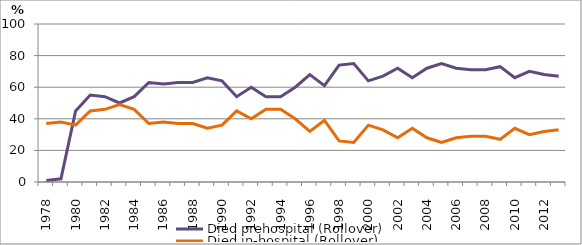
| Category | Died prehospital (Rollover) | Died in-hospital (Rollover) |
|---|---|---|
| 1978.0 | 1 | 37 |
| 1979.0 | 2 | 38 |
| 1980.0 | 45 | 36 |
| 1981.0 | 55 | 45 |
| 1982.0 | 54 | 46 |
| 1983.0 | 50 | 49 |
| 1984.0 | 54 | 46 |
| 1985.0 | 63 | 37 |
| 1986.0 | 62 | 38 |
| 1987.0 | 63 | 37 |
| 1988.0 | 63 | 37 |
| 1989.0 | 66 | 34 |
| 1990.0 | 64 | 36 |
| 1991.0 | 54 | 45 |
| 1992.0 | 60 | 40 |
| 1993.0 | 54 | 46 |
| 1994.0 | 54 | 46 |
| 1995.0 | 60 | 40 |
| 1996.0 | 68 | 32 |
| 1997.0 | 61 | 39 |
| 1998.0 | 74 | 26 |
| 1999.0 | 75 | 25 |
| 2000.0 | 64 | 36 |
| 2001.0 | 67 | 33 |
| 2002.0 | 72 | 28 |
| 2003.0 | 66 | 34 |
| 2004.0 | 72 | 28 |
| 2005.0 | 75 | 25 |
| 2006.0 | 72 | 28 |
| 2007.0 | 71 | 29 |
| 2008.0 | 71 | 29 |
| 2009.0 | 73 | 27 |
| 2010.0 | 66 | 34 |
| 2011.0 | 70 | 30 |
| 2012.0 | 68 | 32 |
| 2013.0 | 67 | 33 |